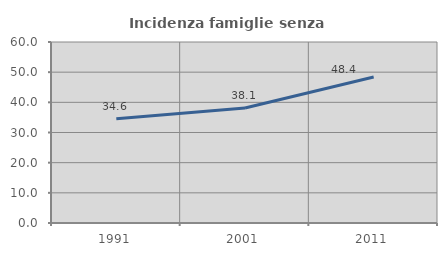
| Category | Incidenza famiglie senza nuclei |
|---|---|
| 1991.0 | 34.591 |
| 2001.0 | 38.095 |
| 2011.0 | 48.419 |